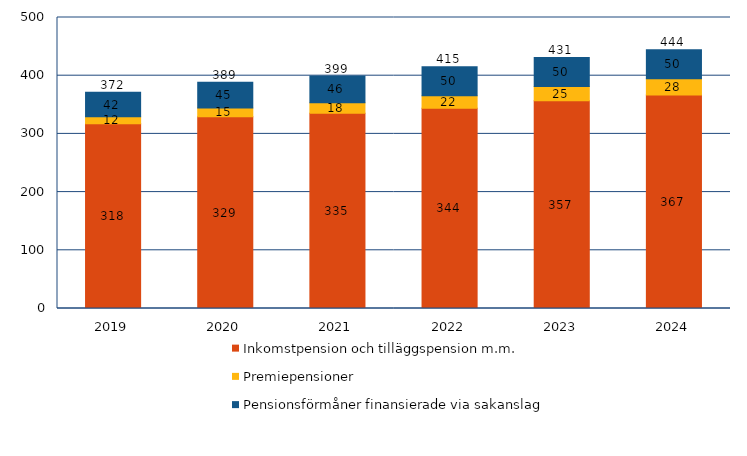
| Category | Inkomstpension och tilläggspension m.m. | Premiepensioner | Pensionsförmåner finansierade via sakanslag | Series 3 |
|---|---|---|---|---|
| 2019.0 | 317.628 | 11.715 | 42.22 | 371.563 |
| 2020.0 | 329.365 | 15.016 | 44.546 | 388.927 |
| 2021.0 | 335.401 | 17.924 | 46.082 | 399.407 |
| 2022.0 | 343.929 | 21.544 | 49.915 | 415.388 |
| 2023.0 | 356.858 | 24.658 | 49.628 | 431.144 |
| 2024.0 | 366.678 | 28.012 | 49.807 | 444.497 |